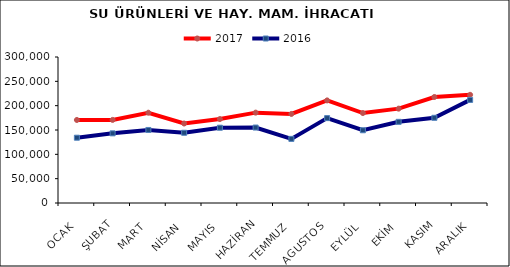
| Category | 2017 | 2016 |
|---|---|---|
| OCAK | 170613.205 | 134162.911 |
| ŞUBAT | 170754.348 | 143119.481 |
| MART | 185513.326 | 150086.955 |
| NİSAN | 163334.723 | 144289.194 |
| MAYIS | 172427.394 | 154677.591 |
| HAZİRAN | 185679.004 | 155034.366 |
| TEMMUZ | 182984.703 | 131760.605 |
| AGUSTOS | 210840.921 | 174431.123 |
| EYLÜL | 184865.389 | 149466.847 |
| EKİM | 193876.56 | 166790.772 |
| KASIM | 217838.88 | 175058.29 |
| ARALIK | 222267.78 | 211824.984 |